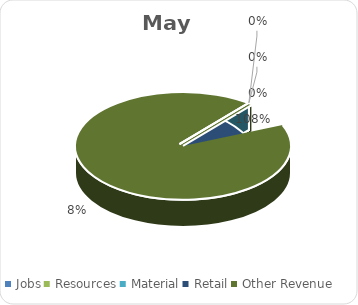
| Category | May |
|---|---|
| Jobs | 0 |
| Resources | 0 |
| Material | 0 |
| Retail | 606033.63 |
| Other Revenue | -42625.19 |